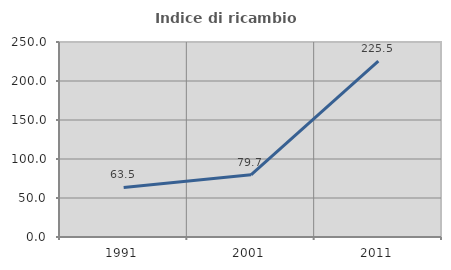
| Category | Indice di ricambio occupazionale  |
|---|---|
| 1991.0 | 63.538 |
| 2001.0 | 79.667 |
| 2011.0 | 225.532 |